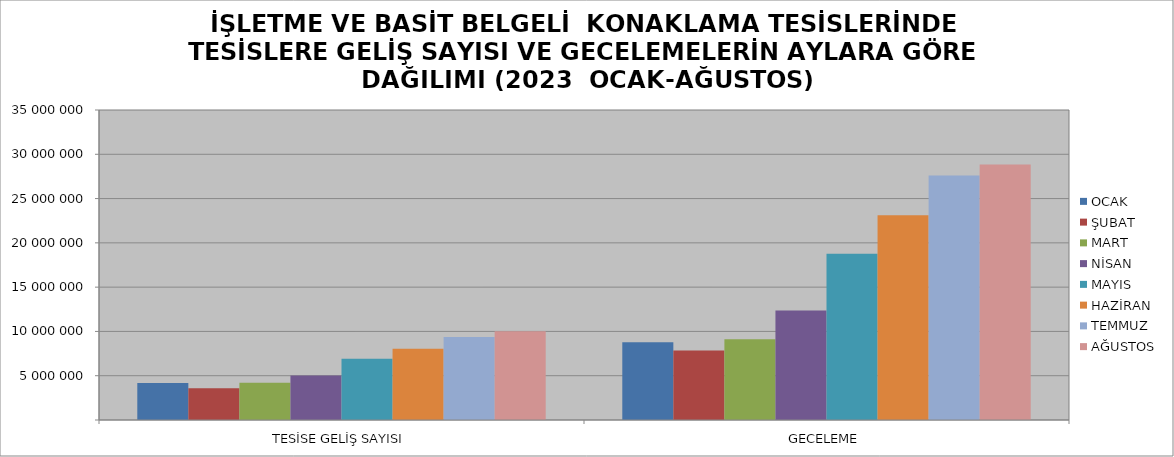
| Category | OCAK | ŞUBAT | MART | NİSAN | MAYIS | HAZİRAN | TEMMUZ | AĞUSTOS |
|---|---|---|---|---|---|---|---|---|
| TESİSE GELİŞ SAYISI | 4176369 | 3577989 | 4200030 | 5022587 | 6927000 | 8050681 | 9379348 | 10028953 |
| GECELEME | 8783046 | 7837722 | 9122802 | 12360237 | 18778808 | 23106038 | 27617279 | 28851182 |